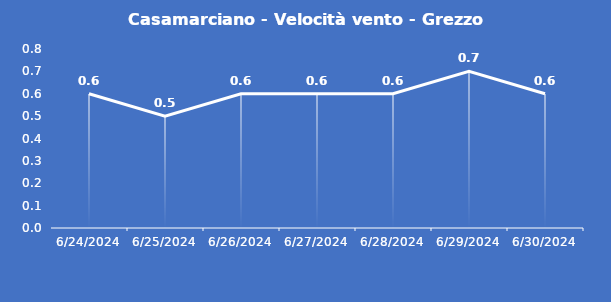
| Category | Casamarciano - Velocità vento - Grezzo (m/s) |
|---|---|
| 6/24/24 | 0.6 |
| 6/25/24 | 0.5 |
| 6/26/24 | 0.6 |
| 6/27/24 | 0.6 |
| 6/28/24 | 0.6 |
| 6/29/24 | 0.7 |
| 6/30/24 | 0.6 |